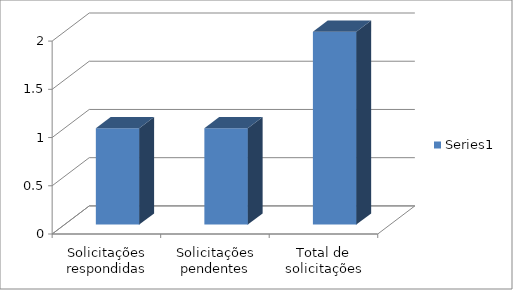
| Category | Series 0 |
|---|---|
| Solicitações respondidas | 1 |
| Solicitações pendentes | 1 |
| Total de solicitações | 2 |